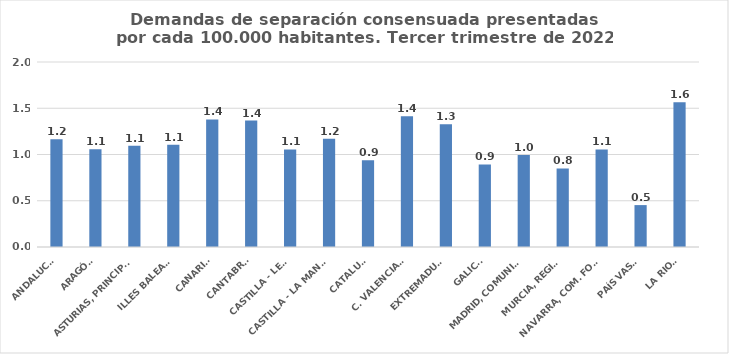
| Category | Series 0 |
|---|---|
| ANDALUCÍA | 1.166 |
| ARAGÓN | 1.056 |
| ASTURIAS, PRINCIPADO | 1.095 |
| ILLES BALEARS | 1.105 |
| CANARIAS | 1.378 |
| CANTABRIA | 1.367 |
| CASTILLA - LEÓN | 1.055 |
| CASTILLA - LA MANCHA | 1.169 |
| CATALUÑA | 0.938 |
| C. VALENCIANA | 1.414 |
| EXTREMADURA | 1.328 |
| GALICIA | 0.892 |
| MADRID, COMUNIDAD | 0.993 |
| MURCIA, REGIÓN | 0.849 |
| NAVARRA, COM. FORAL | 1.055 |
| PAÍS VASCO | 0.453 |
| LA RIOJA | 1.565 |